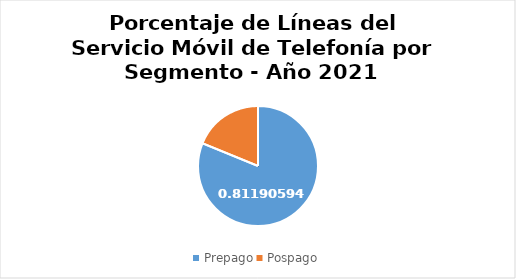
| Category | Series 0 |
|---|---|
| Prepago | 0.812 |
| Pospago | 0.188 |